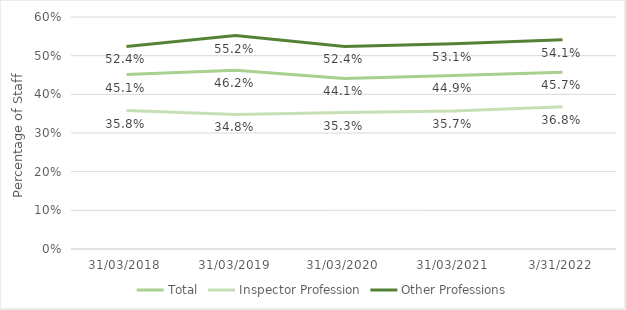
| Category | Total | Inspector Profession | Other Professions |
|---|---|---|---|
| 31/03/2018 | 0.451 | 0.358 | 0.524 |
| 31/03/2019 | 0.462 | 0.348 | 0.552 |
| 31/03/2020 | 0.441 | 0.353 | 0.524 |
| 31/03/2021 | 0.449 | 0.357 | 0.531 |
| 31/03/2022 | 0.457 | 0.368 | 0.541 |